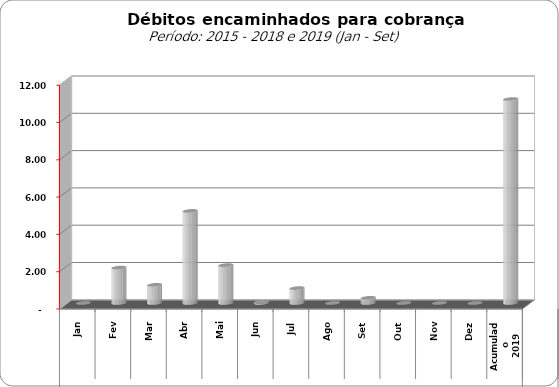
| Category |  3.309.443,02   3.859.728,44   11.181.928,25   7.600.526,01   31.248.623,50   9.830.198,34   20.083.556,95   23.931.734,08   -     1.897.202,11   974.309,37   4.937.737,42   2.030.400,14   66.339,49   799.707,68   -     280.398,44   -     -     -     10.9 |
|---|---|
| 0 | 0 |
| 1 | 1897202.11 |
| 2 | 974309.37 |
| 3 | 4937737.42 |
| 4 | 2030400.14 |
| 5 | 66339.49 |
| 6 | 799707.68 |
| 7 | 0 |
| 8 | 280398.44 |
| 9 | 0 |
| 10 | 0 |
| 11 | 0 |
| 12 | 10937634.89 |